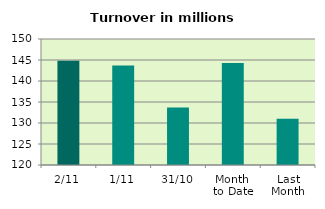
| Category | Series 0 |
|---|---|
| 2/11 | 144.838 |
| 1/11 | 143.712 |
| 31/10 | 133.702 |
| Month 
to Date | 144.275 |
| Last
Month | 131.017 |